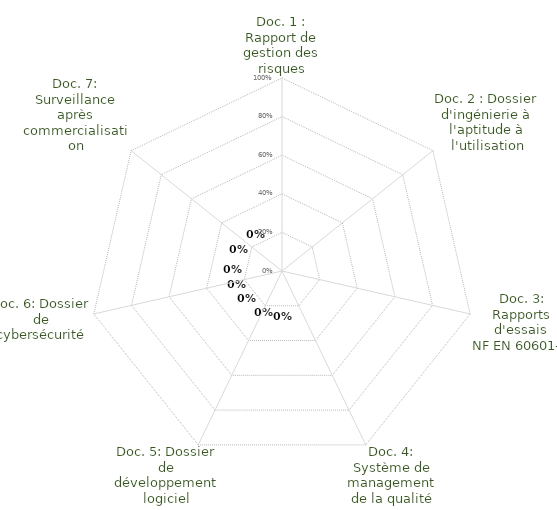
| Category | Series 0 |
|---|---|
| Doc. 1 : Rapport de gestion des risques | 0 |
| Doc. 2 : Dossier d'ingénierie à l'aptitude à l'utilisation | 0 |
| Doc. 3: Rapports d'essais 
NF EN 60601-1 | 0 |
| Doc. 4: Système de management de la qualité | 0 |
| Doc. 5: Dossier de développement logiciel | 0 |
| Doc. 6: Dossier de cybersécurité | 0 |
| Doc. 7: Surveillance après commercialisation | 0 |